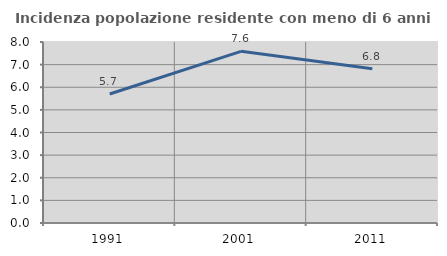
| Category | Incidenza popolazione residente con meno di 6 anni |
|---|---|
| 1991.0 | 5.702 |
| 2001.0 | 7.587 |
| 2011.0 | 6.818 |